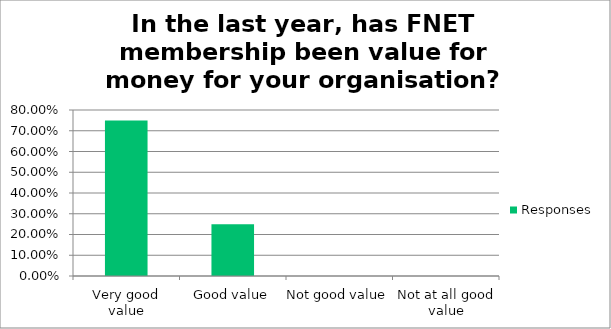
| Category | Responses |
|---|---|
| Very good value | 0.75 |
| Good value | 0.25 |
| Not good value | 0 |
| Not at all good value | 0 |